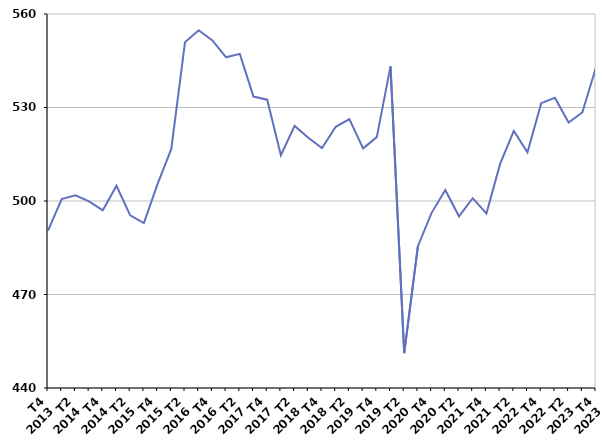
| Category | Ensemble des entrées en catégories A, B, C |
|---|---|
| T4
2013 | 490.5 |
| T1
2014 | 500.6 |
| T2
2014 | 501.8 |
| T3
2014 | 499.9 |
| T4
2014 | 497 |
| T1
2015 | 504.9 |
| T2
2015 | 495.4 |
| T3
2015 | 492.9 |
| T4
2015 | 505.5 |
| T1
2016 | 516.7 |
| T2
2016 | 550.9 |
| T3
2016 | 554.8 |
| T4
2016 | 551.5 |
| T1
2017 | 546.1 |
| T2
2017 | 547.2 |
| T3
2017 | 533.5 |
| T4
2017 | 532.5 |
| T1
2018 | 514.7 |
| T2
2018 | 524.1 |
| T3
2018 | 520.3 |
| T4
2018 | 517 |
| T1
2019 | 523.8 |
| T2
2019 | 526.3 |
| T3
2019 | 516.9 |
| T4
2019 | 520.5 |
| T1
2020 | 543.2 |
| T2
2020 | 451.2 |
| T3
2020 | 485.5 |
| T4
2020 | 496.2 |
| T1
2021 | 503.5 |
| T2
2021 | 495.1 |
| T3
2021 | 500.9 |
| T4
2021 | 496 |
| T1
2022 | 511.9 |
| T2
2022 | 522.5 |
| T3
2022 | 515.6 |
| T4
2022 | 531.4 |
| T1
2023 | 533.1 |
| T2
2023 | 525.2 |
| T3
2023 | 528.4 |
| T4
2023 | 542.9 |